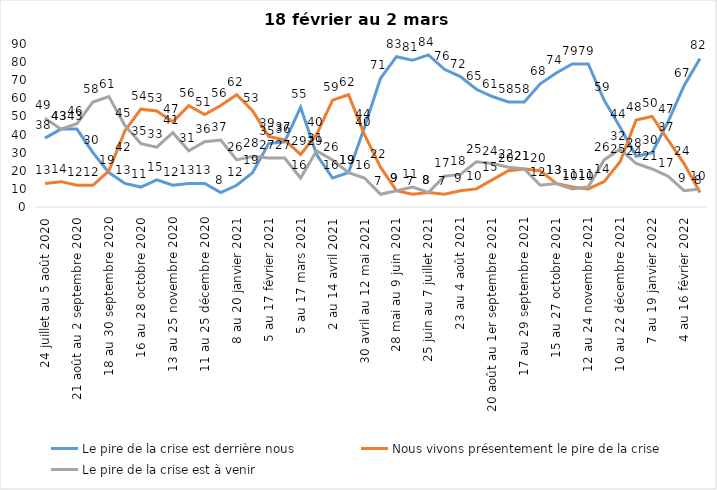
| Category | Le pire de la crise est derrière nous | Nous vivons présentement le pire de la crise | Le pire de la crise est à venir |
|---|---|---|---|
| 24 juillet au 5 août 2020 | 38 | 13 | 49 |
| 7 au 19 août 2020 | 43 | 14 | 43 |
| 21 août au 2 septembre 2020 | 43 | 12 | 46 |
| 4 au 16 septembre 2020 | 30 | 12 | 58 |
| 18 au 30 septembre 2020 | 19 | 20 | 61 |
| 2 au 14 octobre 2020 | 13 | 42 | 45 |
| 16 au 28 octobre 2020 | 11 | 54 | 35 |
| 30 octobre au 11 novembre 2020 | 15 | 53 | 33 |
| 13 au 25 novembre 2020 | 12 | 47 | 41 |
| 27 au 9 décembre 2020 | 13 | 56 | 31 |
| 11 au 25 décembre 2020 | 13 | 51 | 36 |
| 25 décembre 2020 au 6 janvier 2021 | 8 | 56 | 37 |
| 8 au 20 janvier 2021 | 12 | 62 | 26 |
| 22 janvier au 3 février 2021 | 19 | 53 | 28 |
| 5 au 17 février 2021 | 35 | 39 | 27 |
| 19 février au 3 mars 2021 | 36 | 37 | 27 |
| 5 au 17 mars 2021 | 55 | 29 | 16 |
| 19 au 31 mars 2021 | 29 | 40 | 31 |
| 2 au 14 avril 2021 | 16 | 59 | 26 |
| 16 au 28 avril 2021 | 19 | 62 | 19 |
| 30 avril au 12 mai 2021 | 44 | 40 | 16 |
| 14 au 26 mai 2021 | 71 | 22 | 7 |
| 28 mai au 9 juin 2021 | 83 | 9 | 9 |
| 11 au 23 juin 2021 | 81 | 7 | 11 |
| 25 juin au 7 juillet 2021 | 84 | 8 | 8 |
| 9 au 21 juillet 2021 | 76 | 7 | 17 |
| 23 au 4 août 2021 | 72 | 9 | 18 |
| 6 au 18 août 2021 | 65 | 10 | 25 |
| 20 août au 1er septembre 2021 | 61 | 15 | 24 |
| 3 au 15 septembre 2021 | 58 | 20 | 22 |
| 17 au 29 septembre 2021 | 58 | 21 | 21 |
| 1 au 13 octobre 2021 | 68 | 20 | 12 |
| 15 au 27 octobre 2021 | 74 | 13 | 13 |
| 29 octobre au 10 novembre 2021 | 79 | 11 | 10 |
| 12 au 24 novembre 2021 | 79 | 10 | 11 |
| 26 novembre au 8 décembre 2021 | 59 | 14 | 26 |
| 10 au 22 décembre 2021 | 44 | 25 | 32 |
| 24 décembre 2021 au 5 janvier 2022 | 28 | 48 | 24 |
| 7 au 19 janvier 2022 | 30 | 50 | 21 |
| 21 janvier au 2 février 2022 | 47 | 37 | 17 |
| 4 au 16 février 2022 | 67 | 24 | 9 |
| 18 février au 2 mars  2022 | 82 | 8 | 10 |